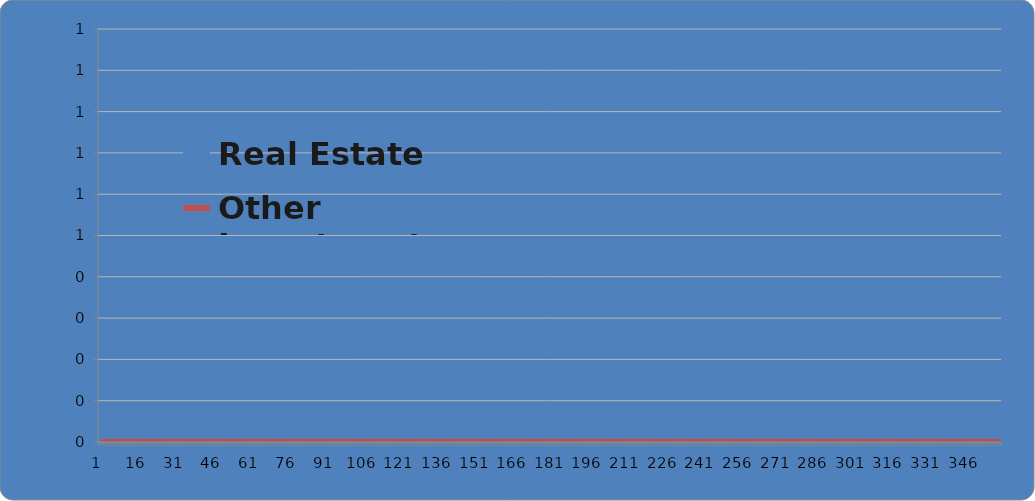
| Category | Real Estate | Other Investment |
|---|---|---|
| 0 | 0 | 0 |
| 1 | 0 | 0 |
| 2 | 0 | 0 |
| 3 | 0 | 0 |
| 4 | 0 | 0 |
| 5 | 0 | 0 |
| 6 | 0 | 0 |
| 7 | 0 | 0 |
| 8 | 0 | 0 |
| 9 | 0 | 0 |
| 10 | 0 | 0 |
| 11 | 0 | 0 |
| 12 | 0 | 0 |
| 13 | 0 | 0 |
| 14 | 0 | 0 |
| 15 | 0 | 0 |
| 16 | 0 | 0 |
| 17 | 0 | 0 |
| 18 | 0 | 0 |
| 19 | 0 | 0 |
| 20 | 0 | 0 |
| 21 | 0 | 0 |
| 22 | 0 | 0 |
| 23 | 0 | 0 |
| 24 | 0 | 0 |
| 25 | 0 | 0 |
| 26 | 0 | 0 |
| 27 | 0 | 0 |
| 28 | 0 | 0 |
| 29 | 0 | 0 |
| 30 | 0 | 0 |
| 31 | 0 | 0 |
| 32 | 0 | 0 |
| 33 | 0 | 0 |
| 34 | 0 | 0 |
| 35 | 0 | 0 |
| 36 | 0 | 0 |
| 37 | 0 | 0 |
| 38 | 0 | 0 |
| 39 | 0 | 0 |
| 40 | 0 | 0 |
| 41 | 0 | 0 |
| 42 | 0 | 0 |
| 43 | 0 | 0 |
| 44 | 0 | 0 |
| 45 | 0 | 0 |
| 46 | 0 | 0 |
| 47 | 0 | 0 |
| 48 | 0 | 0 |
| 49 | 0 | 0 |
| 50 | 0 | 0 |
| 51 | 0 | 0 |
| 52 | 0 | 0 |
| 53 | 0 | 0 |
| 54 | 0 | 0 |
| 55 | 0 | 0 |
| 56 | 0 | 0 |
| 57 | 0 | 0 |
| 58 | 0 | 0 |
| 59 | 0 | 0 |
| 60 | 0 | 0 |
| 61 | 0 | 0 |
| 62 | 0 | 0 |
| 63 | 0 | 0 |
| 64 | 0 | 0 |
| 65 | 0 | 0 |
| 66 | 0 | 0 |
| 67 | 0 | 0 |
| 68 | 0 | 0 |
| 69 | 0 | 0 |
| 70 | 0 | 0 |
| 71 | 0 | 0 |
| 72 | 0 | 0 |
| 73 | 0 | 0 |
| 74 | 0 | 0 |
| 75 | 0 | 0 |
| 76 | 0 | 0 |
| 77 | 0 | 0 |
| 78 | 0 | 0 |
| 79 | 0 | 0 |
| 80 | 0 | 0 |
| 81 | 0 | 0 |
| 82 | 0 | 0 |
| 83 | 0 | 0 |
| 84 | 0 | 0 |
| 85 | 0 | 0 |
| 86 | 0 | 0 |
| 87 | 0 | 0 |
| 88 | 0 | 0 |
| 89 | 0 | 0 |
| 90 | 0 | 0 |
| 91 | 0 | 0 |
| 92 | 0 | 0 |
| 93 | 0 | 0 |
| 94 | 0 | 0 |
| 95 | 0 | 0 |
| 96 | 0 | 0 |
| 97 | 0 | 0 |
| 98 | 0 | 0 |
| 99 | 0 | 0 |
| 100 | 0 | 0 |
| 101 | 0 | 0 |
| 102 | 0 | 0 |
| 103 | 0 | 0 |
| 104 | 0 | 0 |
| 105 | 0 | 0 |
| 106 | 0 | 0 |
| 107 | 0 | 0 |
| 108 | 0 | 0 |
| 109 | 0 | 0 |
| 110 | 0 | 0 |
| 111 | 0 | 0 |
| 112 | 0 | 0 |
| 113 | 0 | 0 |
| 114 | 0 | 0 |
| 115 | 0 | 0 |
| 116 | 0 | 0 |
| 117 | 0 | 0 |
| 118 | 0 | 0 |
| 119 | 0 | 0 |
| 120 | 0 | 0 |
| 121 | 0 | 0 |
| 122 | 0 | 0 |
| 123 | 0 | 0 |
| 124 | 0 | 0 |
| 125 | 0 | 0 |
| 126 | 0 | 0 |
| 127 | 0 | 0 |
| 128 | 0 | 0 |
| 129 | 0 | 0 |
| 130 | 0 | 0 |
| 131 | 0 | 0 |
| 132 | 0 | 0 |
| 133 | 0 | 0 |
| 134 | 0 | 0 |
| 135 | 0 | 0 |
| 136 | 0 | 0 |
| 137 | 0 | 0 |
| 138 | 0 | 0 |
| 139 | 0 | 0 |
| 140 | 0 | 0 |
| 141 | 0 | 0 |
| 142 | 0 | 0 |
| 143 | 0 | 0 |
| 144 | 0 | 0 |
| 145 | 0 | 0 |
| 146 | 0 | 0 |
| 147 | 0 | 0 |
| 148 | 0 | 0 |
| 149 | 0 | 0 |
| 150 | 0 | 0 |
| 151 | 0 | 0 |
| 152 | 0 | 0 |
| 153 | 0 | 0 |
| 154 | 0 | 0 |
| 155 | 0 | 0 |
| 156 | 0 | 0 |
| 157 | 0 | 0 |
| 158 | 0 | 0 |
| 159 | 0 | 0 |
| 160 | 0 | 0 |
| 161 | 0 | 0 |
| 162 | 0 | 0 |
| 163 | 0 | 0 |
| 164 | 0 | 0 |
| 165 | 0 | 0 |
| 166 | 0 | 0 |
| 167 | 0 | 0 |
| 168 | 0 | 0 |
| 169 | 0 | 0 |
| 170 | 0 | 0 |
| 171 | 0 | 0 |
| 172 | 0 | 0 |
| 173 | 0 | 0 |
| 174 | 0 | 0 |
| 175 | 0 | 0 |
| 176 | 0 | 0 |
| 177 | 0 | 0 |
| 178 | 0 | 0 |
| 179 | 0 | 0 |
| 180 | 0 | 0 |
| 181 | 0 | 0 |
| 182 | 0 | 0 |
| 183 | 0 | 0 |
| 184 | 0 | 0 |
| 185 | 0 | 0 |
| 186 | 0 | 0 |
| 187 | 0 | 0 |
| 188 | 0 | 0 |
| 189 | 0 | 0 |
| 190 | 0 | 0 |
| 191 | 0 | 0 |
| 192 | 0 | 0 |
| 193 | 0 | 0 |
| 194 | 0 | 0 |
| 195 | 0 | 0 |
| 196 | 0 | 0 |
| 197 | 0 | 0 |
| 198 | 0 | 0 |
| 199 | 0 | 0 |
| 200 | 0 | 0 |
| 201 | 0 | 0 |
| 202 | 0 | 0 |
| 203 | 0 | 0 |
| 204 | 0 | 0 |
| 205 | 0 | 0 |
| 206 | 0 | 0 |
| 207 | 0 | 0 |
| 208 | 0 | 0 |
| 209 | 0 | 0 |
| 210 | 0 | 0 |
| 211 | 0 | 0 |
| 212 | 0 | 0 |
| 213 | 0 | 0 |
| 214 | 0 | 0 |
| 215 | 0 | 0 |
| 216 | 0 | 0 |
| 217 | 0 | 0 |
| 218 | 0 | 0 |
| 219 | 0 | 0 |
| 220 | 0 | 0 |
| 221 | 0 | 0 |
| 222 | 0 | 0 |
| 223 | 0 | 0 |
| 224 | 0 | 0 |
| 225 | 0 | 0 |
| 226 | 0 | 0 |
| 227 | 0 | 0 |
| 228 | 0 | 0 |
| 229 | 0 | 0 |
| 230 | 0 | 0 |
| 231 | 0 | 0 |
| 232 | 0 | 0 |
| 233 | 0 | 0 |
| 234 | 0 | 0 |
| 235 | 0 | 0 |
| 236 | 0 | 0 |
| 237 | 0 | 0 |
| 238 | 0 | 0 |
| 239 | 0 | 0 |
| 240 | 0 | 0 |
| 241 | 0 | 0 |
| 242 | 0 | 0 |
| 243 | 0 | 0 |
| 244 | 0 | 0 |
| 245 | 0 | 0 |
| 246 | 0 | 0 |
| 247 | 0 | 0 |
| 248 | 0 | 0 |
| 249 | 0 | 0 |
| 250 | 0 | 0 |
| 251 | 0 | 0 |
| 252 | 0 | 0 |
| 253 | 0 | 0 |
| 254 | 0 | 0 |
| 255 | 0 | 0 |
| 256 | 0 | 0 |
| 257 | 0 | 0 |
| 258 | 0 | 0 |
| 259 | 0 | 0 |
| 260 | 0 | 0 |
| 261 | 0 | 0 |
| 262 | 0 | 0 |
| 263 | 0 | 0 |
| 264 | 0 | 0 |
| 265 | 0 | 0 |
| 266 | 0 | 0 |
| 267 | 0 | 0 |
| 268 | 0 | 0 |
| 269 | 0 | 0 |
| 270 | 0 | 0 |
| 271 | 0 | 0 |
| 272 | 0 | 0 |
| 273 | 0 | 0 |
| 274 | 0 | 0 |
| 275 | 0 | 0 |
| 276 | 0 | 0 |
| 277 | 0 | 0 |
| 278 | 0 | 0 |
| 279 | 0 | 0 |
| 280 | 0 | 0 |
| 281 | 0 | 0 |
| 282 | 0 | 0 |
| 283 | 0 | 0 |
| 284 | 0 | 0 |
| 285 | 0 | 0 |
| 286 | 0 | 0 |
| 287 | 0 | 0 |
| 288 | 0 | 0 |
| 289 | 0 | 0 |
| 290 | 0 | 0 |
| 291 | 0 | 0 |
| 292 | 0 | 0 |
| 293 | 0 | 0 |
| 294 | 0 | 0 |
| 295 | 0 | 0 |
| 296 | 0 | 0 |
| 297 | 0 | 0 |
| 298 | 0 | 0 |
| 299 | 0 | 0 |
| 300 | 0 | 0 |
| 301 | 0 | 0 |
| 302 | 0 | 0 |
| 303 | 0 | 0 |
| 304 | 0 | 0 |
| 305 | 0 | 0 |
| 306 | 0 | 0 |
| 307 | 0 | 0 |
| 308 | 0 | 0 |
| 309 | 0 | 0 |
| 310 | 0 | 0 |
| 311 | 0 | 0 |
| 312 | 0 | 0 |
| 313 | 0 | 0 |
| 314 | 0 | 0 |
| 315 | 0 | 0 |
| 316 | 0 | 0 |
| 317 | 0 | 0 |
| 318 | 0 | 0 |
| 319 | 0 | 0 |
| 320 | 0 | 0 |
| 321 | 0 | 0 |
| 322 | 0 | 0 |
| 323 | 0 | 0 |
| 324 | 0 | 0 |
| 325 | 0 | 0 |
| 326 | 0 | 0 |
| 327 | 0 | 0 |
| 328 | 0 | 0 |
| 329 | 0 | 0 |
| 330 | 0 | 0 |
| 331 | 0 | 0 |
| 332 | 0 | 0 |
| 333 | 0 | 0 |
| 334 | 0 | 0 |
| 335 | 0 | 0 |
| 336 | 0 | 0 |
| 337 | 0 | 0 |
| 338 | 0 | 0 |
| 339 | 0 | 0 |
| 340 | 0 | 0 |
| 341 | 0 | 0 |
| 342 | 0 | 0 |
| 343 | 0 | 0 |
| 344 | 0 | 0 |
| 345 | 0 | 0 |
| 346 | 0 | 0 |
| 347 | 0 | 0 |
| 348 | 0 | 0 |
| 349 | 0 | 0 |
| 350 | 0 | 0 |
| 351 | 0 | 0 |
| 352 | 0 | 0 |
| 353 | 0 | 0 |
| 354 | 0 | 0 |
| 355 | 0 | 0 |
| 356 | 0 | 0 |
| 357 | 0 | 0 |
| 358 | 0 | 0 |
| 359 | 0 | 0 |